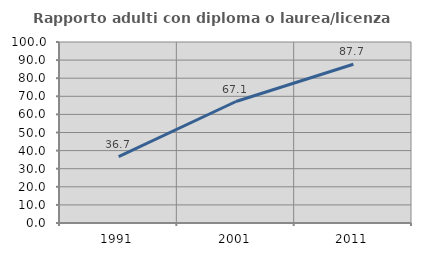
| Category | Rapporto adulti con diploma o laurea/licenza media  |
|---|---|
| 1991.0 | 36.695 |
| 2001.0 | 67.12 |
| 2011.0 | 87.713 |